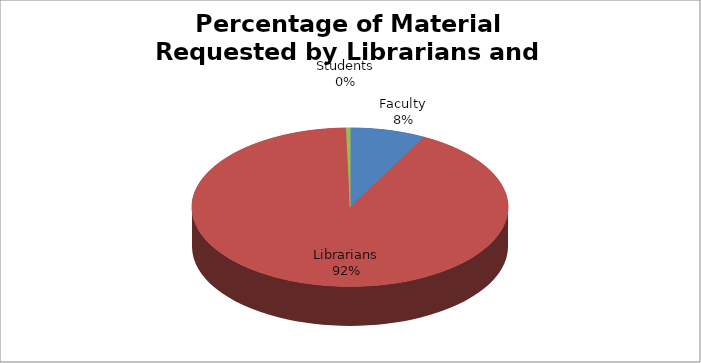
| Category | Series 0 |
|---|---|
| Faculty | 188 |
| Librarians | 2235 |
| Students | 10 |